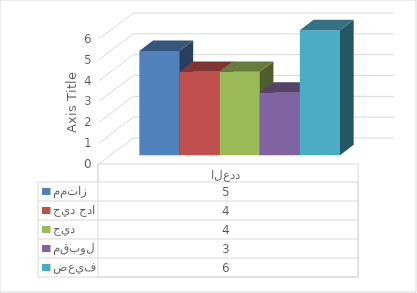
| Category | ممتاز | جيد جدا | جيد | مقبول | ضعيف |
|---|---|---|---|---|---|
| العدد | 5 | 4 | 4 | 3 | 6 |